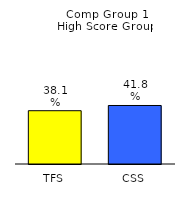
| Category | Series 0 |
|---|---|
| TFS | 0.381 |
| CSS | 0.418 |